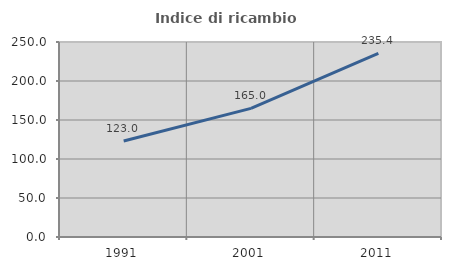
| Category | Indice di ricambio occupazionale  |
|---|---|
| 1991.0 | 123.02 |
| 2001.0 | 164.963 |
| 2011.0 | 235.433 |